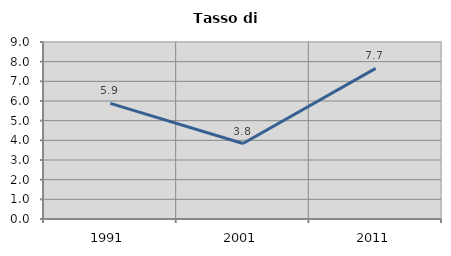
| Category | Tasso di disoccupazione   |
|---|---|
| 1991.0 | 5.879 |
| 2001.0 | 3.839 |
| 2011.0 | 7.659 |